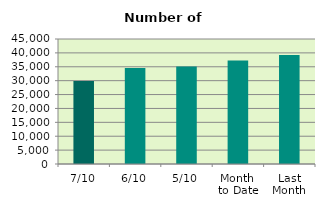
| Category | Series 0 |
|---|---|
| 7/10 | 29904 |
| 6/10 | 34590 |
| 5/10 | 35142 |
| Month 
to Date | 37273.2 |
| Last
Month | 39229.818 |